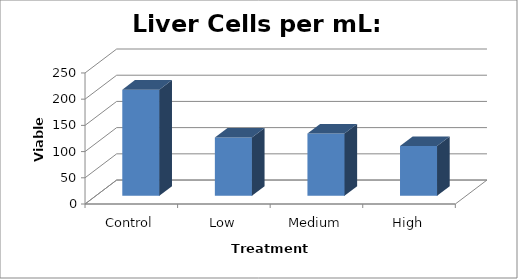
| Category | Series 0 |
|---|---|
| Control | 202.5 |
| Low | 111.25 |
| Medium | 118.75 |
| High | 95 |